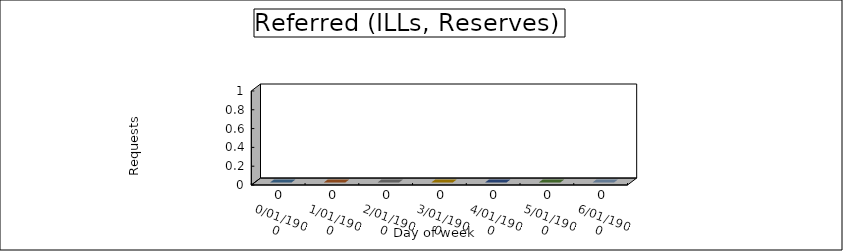
| Category | Referred (ILLs, Reserves) |
|---|---|
| 0.0 | 0 |
| 1900-01-01 | 0 |
| 1900-01-02 | 0 |
| 1900-01-03 | 0 |
| 1900-01-04 | 0 |
| 1900-01-05 | 0 |
| 1900-01-06 | 0 |